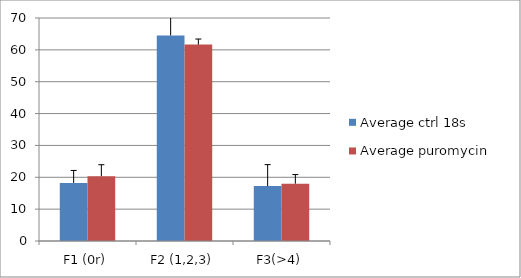
| Category | Average ctrl 18s | Average puromycin  18s  |
|---|---|---|
| F1 (0r) | 18.244 | 20.359 |
| F2 (1,2,3) | 64.527 | 61.645 |
| F3(>4) | 17.228 | 17.996 |